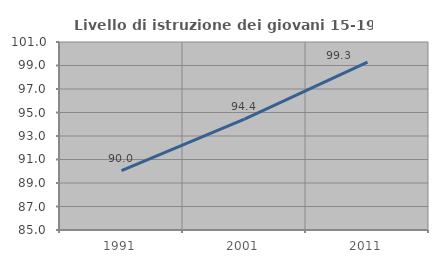
| Category | Livello di istruzione dei giovani 15-19 anni |
|---|---|
| 1991.0 | 90.047 |
| 2001.0 | 94.444 |
| 2011.0 | 99.286 |